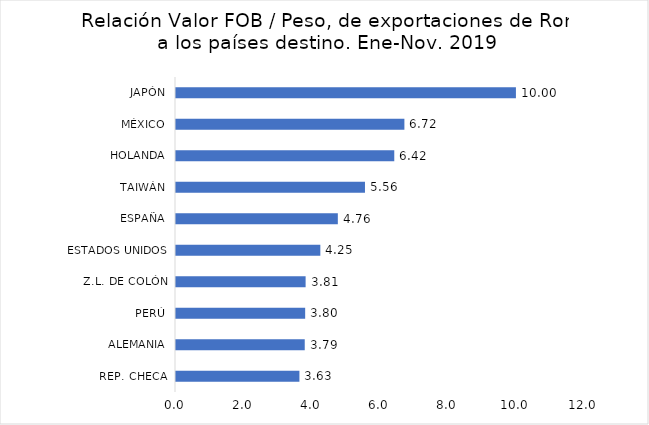
| Category | Series 0 |
|---|---|
| REP. CHECA | 3.63 |
| ALEMANIA | 3.786 |
| PERÚ | 3.799 |
| Z.L. DE COLÓN | 3.812 |
| ESTADOS UNIDOS | 4.245 |
| ESPAÑA | 4.76 |
| TAIWÁN | 5.558 |
| HOLANDA | 6.42 |
| MÉXICO | 6.718 |
| JAPÓN | 9.998 |